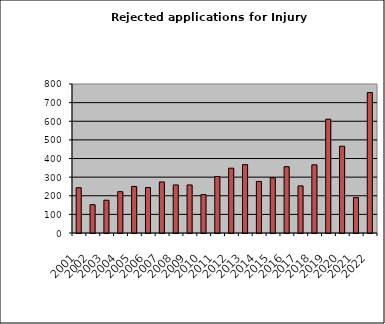
| Category | Series 0 |
|---|---|
| 2001.0 | 243 |
| 2002.0 | 152 |
| 2003.0 | 176 |
| 2004.0 | 222 |
| 2005.0 | 250 |
| 2006.0 | 244 |
| 2007.0 | 274 |
| 2008.0 | 258 |
| 2009.0 | 258 |
| 2010.0 | 206 |
| 2011.0 | 303 |
| 2012.0 | 348 |
| 2013.0 | 367 |
| 2014.0 | 277 |
| 2015.0 | 296 |
| 2016.0 | 356 |
| 2017.0 | 253 |
| 2018.0 | 366 |
| 2019.0 | 611 |
| 2020.0 | 466 |
| 2021.0 | 190 |
| 2022.0 | 754 |